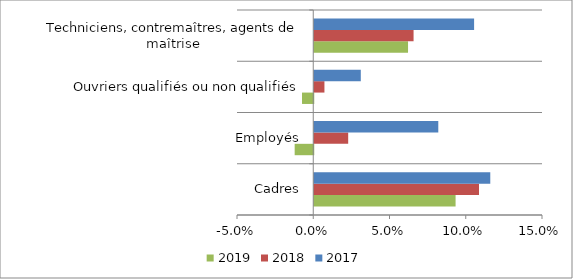
| Category | 2019 | 2018 | 2017 |
|---|---|---|---|
| Cadres | 0.093 | 0.108 | 0.115 |
| Employés | -0.012 | 0.022 | 0.081 |
| Ouvriers qualifiés ou non qualifiés | -0.007 | 0.007 | 0.031 |
| Techniciens, contremaîtres, agents de maîtrise | 0.061 | 0.065 | 0.105 |